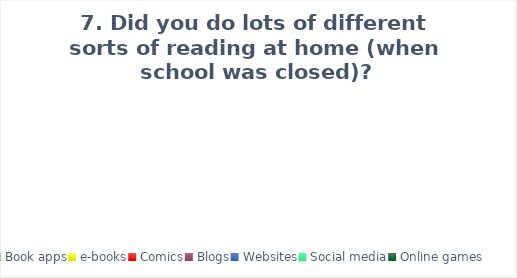
| Category | Series 0 |
|---|---|
| Book apps | 0 |
| e-books | 0 |
| Comics | 0 |
| Blogs | 0 |
| Websites | 0 |
| Social media | 0 |
| Online games | 0 |